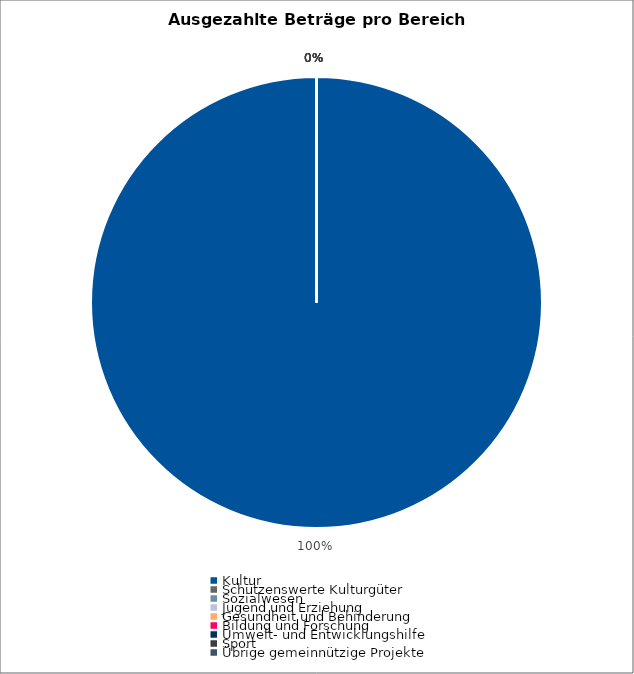
| Category | Series 0 |
|---|---|
| Kultur | 24833250.9 |
| Schützenswerte Kulturgüter | 0 |
| Sozialwesen | 0 |
| Jugend und Erziehung | 0 |
| Gesundheit und Behinderung | 0 |
| Bildung und Forschung | 0 |
| Umwelt- und Entwicklungshilfe | 0 |
| Sport | 0 |
| Übrige gemeinnützige Projekte | 0 |